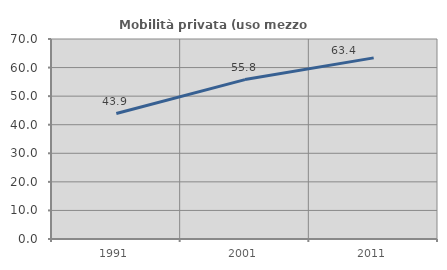
| Category | Mobilità privata (uso mezzo privato) |
|---|---|
| 1991.0 | 43.902 |
| 2001.0 | 55.789 |
| 2011.0 | 63.393 |